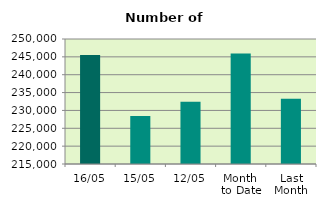
| Category | Series 0 |
|---|---|
| 16/05 | 245532 |
| 15/05 | 228458 |
| 12/05 | 232414 |
| Month 
to Date | 245952.364 |
| Last
Month | 233247 |